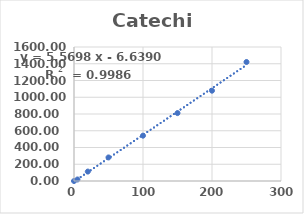
| Category | Area |
|---|---|
| 0.0 | 0 |
| 5.0 | 18.16 |
| 20.0 | 112.57 |
| 50.0 | 281.27 |
| 100.0 | 541.37 |
| 150.0 | 810.82 |
| 200.0 | 1078.4 |
| 250.0 | 1420.9 |